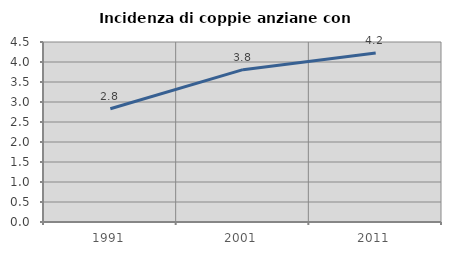
| Category | Incidenza di coppie anziane con figli |
|---|---|
| 1991.0 | 2.832 |
| 2001.0 | 3.808 |
| 2011.0 | 4.227 |